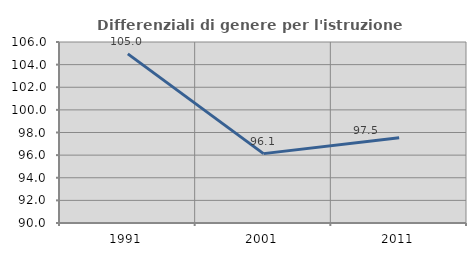
| Category | Differenziali di genere per l'istruzione superiore |
|---|---|
| 1991.0 | 104.95 |
| 2001.0 | 96.132 |
| 2011.0 | 97.533 |